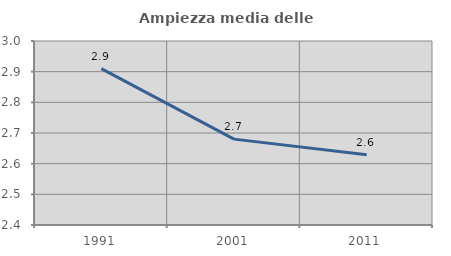
| Category | Ampiezza media delle famiglie |
|---|---|
| 1991.0 | 2.91 |
| 2001.0 | 2.68 |
| 2011.0 | 2.629 |